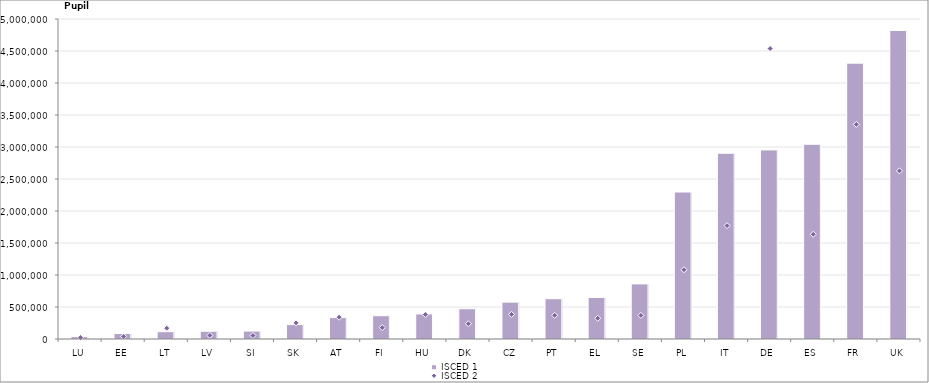
| Category | ISCED 1 |
|---|---|
| LU | 37452 |
| EE | 85617 |
| LT | 113881 |
| LV | 121506 |
| SI | 123998 |
| SK | 225427 |
| AT | 334933 |
| FI | 363990 |
| HU | 390970 |
| DK | 472523 |
| CZ | 575980 |
| PT | 629804 |
| EL | 649246 |
| SE | 861086 |
| PL | 2296529 |
| IT | 2902379 |
| DE | 2954775 |
| ES | 3042396 |
| FR | 4309942 |
| UK | 4820283 |